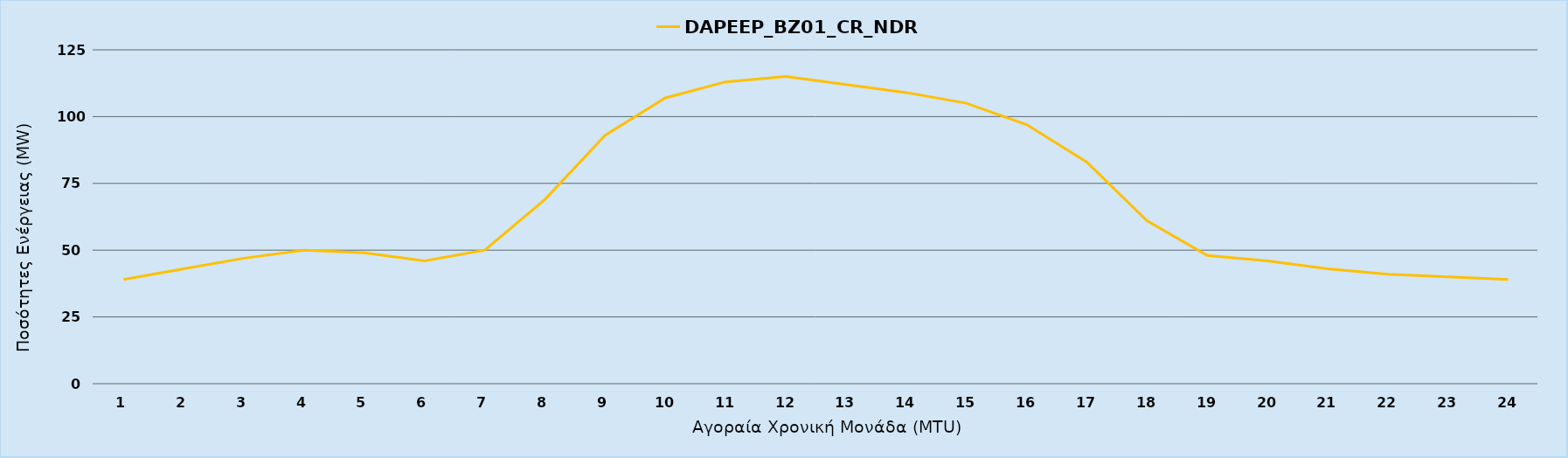
| Category | DAPEEP_BZ01_CR_NDR |
|---|---|
| 0 | 39 |
| 1 | 43 |
| 2 | 47 |
| 3 | 50 |
| 4 | 49 |
| 5 | 46 |
| 6 | 50 |
| 7 | 69 |
| 8 | 93 |
| 9 | 107 |
| 10 | 113 |
| 11 | 115 |
| 12 | 112 |
| 13 | 109 |
| 14 | 105 |
| 15 | 97 |
| 16 | 83 |
| 17 | 61 |
| 18 | 48 |
| 19 | 46 |
| 20 | 43 |
| 21 | 41 |
| 22 | 40 |
| 23 | 39 |